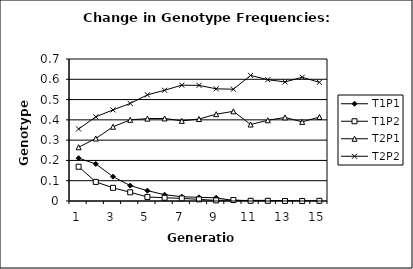
| Category | T1P1 | T1P2 | T2P1 | T2P2 |
|---|---|---|---|---|
| 0 | 0.211 | 0.169 | 0.265 | 0.355 |
| 1 | 0.183 | 0.094 | 0.308 | 0.415 |
| 2 | 0.12 | 0.065 | 0.366 | 0.449 |
| 3 | 0.076 | 0.043 | 0.4 | 0.481 |
| 4 | 0.051 | 0.02 | 0.406 | 0.523 |
| 5 | 0.031 | 0.016 | 0.407 | 0.546 |
| 6 | 0.021 | 0.013 | 0.395 | 0.571 |
| 7 | 0.018 | 0.008 | 0.404 | 0.57 |
| 8 | 0.016 | 0.003 | 0.428 | 0.553 |
| 9 | 0.002 | 0.005 | 0.442 | 0.551 |
| 10 | 0.003 | 0.001 | 0.377 | 0.619 |
| 11 | 0.003 | 0.001 | 0.398 | 0.598 |
| 12 | 0.001 | 0 | 0.412 | 0.587 |
| 13 | 0 | 0 | 0.39 | 0.61 |
| 14 | 0 | 0.001 | 0.414 | 0.585 |